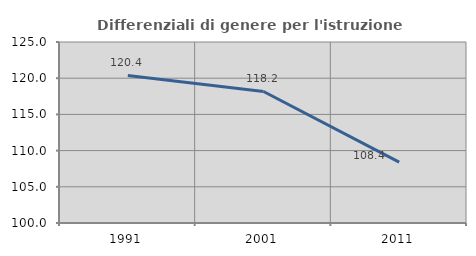
| Category | Differenziali di genere per l'istruzione superiore |
|---|---|
| 1991.0 | 120.383 |
| 2001.0 | 118.166 |
| 2011.0 | 108.403 |